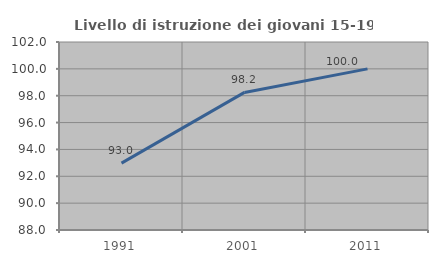
| Category | Livello di istruzione dei giovani 15-19 anni |
|---|---|
| 1991.0 | 92.982 |
| 2001.0 | 98.246 |
| 2011.0 | 100 |